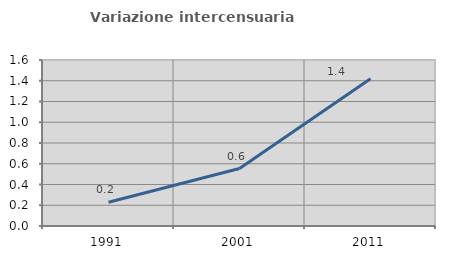
| Category | Variazione intercensuaria annua |
|---|---|
| 1991.0 | 0.229 |
| 2001.0 | 0.554 |
| 2011.0 | 1.419 |